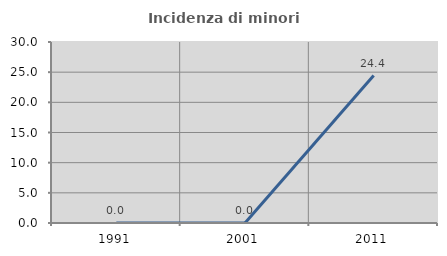
| Category | Incidenza di minori stranieri |
|---|---|
| 1991.0 | 0 |
| 2001.0 | 0 |
| 2011.0 | 24.444 |